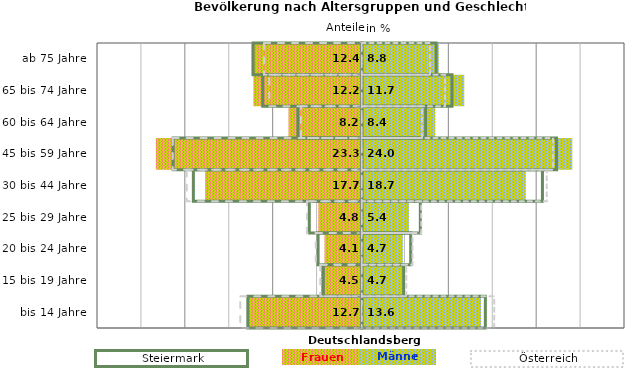
| Category | Frauen | Männer | Frauen Spalte2 | Männer Spalte2 | Frauen Spalte3 | Männer Spalte3 |
|---|---|---|---|---|---|---|
| bis 14 Jahre | -12.7 | 13.6 | 14.1 | -13 | -13.8 | 15.1 |
| 15 bis 19 Jahre | -4.5 | 4.7 | 4.8 | -4.4 | -4.7 | 5.1 |
| 20 bis 24 Jahre | -4.1 | 4.7 | 5.6 | -5 | -5.2 | 5.8 |
| 25 bis 29 Jahre | -4.8 | 5.4 | 6.7 | -6 | -6.2 | 6.8 |
| 30 bis 44 Jahre | -17.7 | 18.7 | 20.6 | -19.2 | -19.9 | 21.1 |
| 45 bis 59 Jahre | -23.3 | 24 | 22.2 | -21.5 | -21.5 | 21.8 |
| 60 bis 64 Jahre | -8.2 | 8.4 | 7.3 | -7.3 | -6.9 | 6.9 |
| 65 bis 74 Jahre | -12.2 | 11.7 | 10.3 | -11.3 | -10.5 | 9.5 |
| ab 75 Jahre | -12.4 | 8.8 | 8.5 | -12.4 | -11.1 | 7.8 |